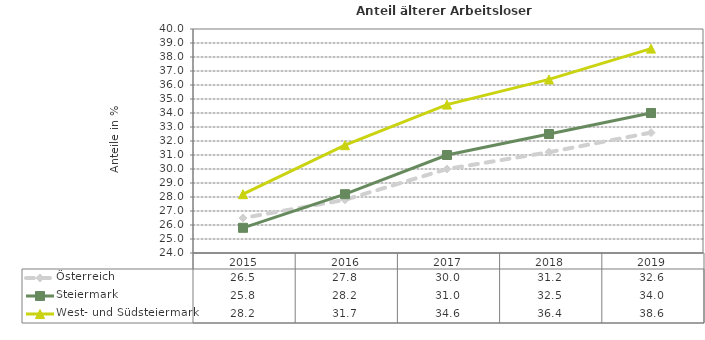
| Category | Österreich | Steiermark | West- und Südsteiermark |
|---|---|---|---|
| 2019.0 | 32.6 | 34 | 38.6 |
| 2018.0 | 31.2 | 32.5 | 36.4 |
| 2017.0 | 30 | 31 | 34.6 |
| 2016.0 | 27.8 | 28.2 | 31.7 |
| 2015.0 | 26.5 | 25.8 | 28.2 |